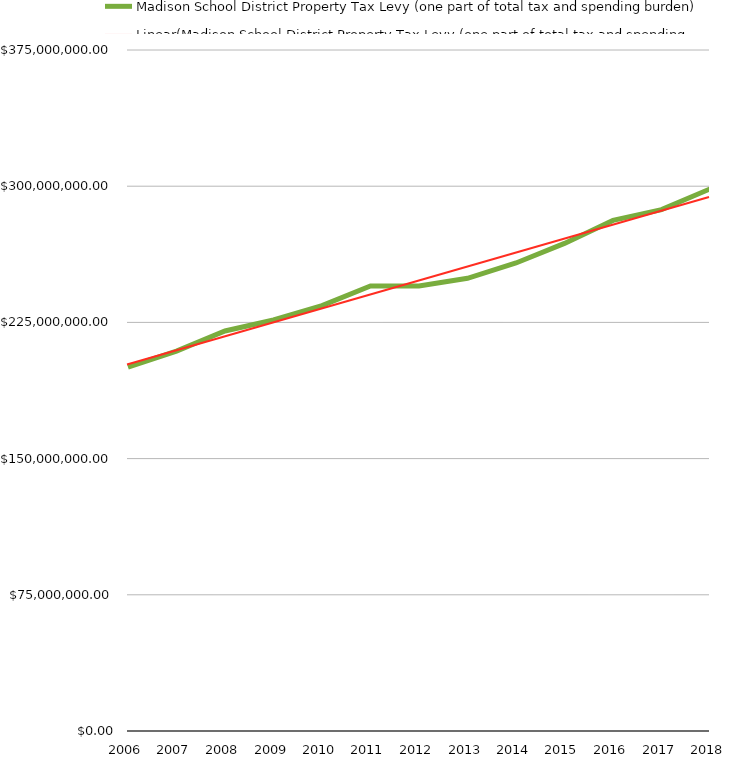
| Category | Madison School District Property Tax Levy (one part of total tax and spending burden) |
|---|---|
| 2006 | 200363255 |
| 2007 | 209206079 |
| 2008 | 220290484 |
| 2009 | 226330285 |
| 2010 | 234240964 |
| 2011 | 245064722 |
| 2012 | 245002675 |
| 2013 | 249290082 |
| 2014 | 257727292 |
| 2015 | 268500293 |
| 2016 | 281158559 |
| 2017 | 287092023 |
| 2018 | 298495588 |